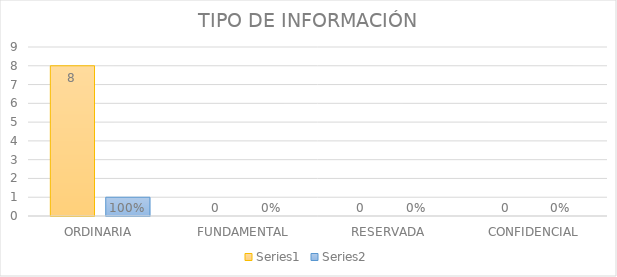
| Category | Series 3 | Series 4 |
|---|---|---|
| ORDINARIA | 8 | 1 |
| FUNDAMENTAL | 0 | 0 |
| RESERVADA | 0 | 0 |
| CONFIDENCIAL | 0 | 0 |